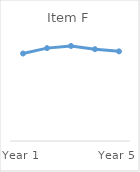
| Category | Item F |
|---|---|
| Year 1 | 0.81 |
| Year 2 | 0.86 |
| Year 3 | 0.88 |
| Year 4 | 0.85 |
| Year 5 | 0.83 |